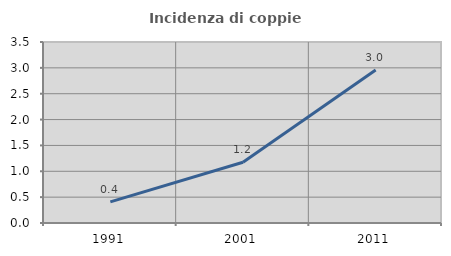
| Category | Incidenza di coppie miste |
|---|---|
| 1991.0 | 0.408 |
| 2001.0 | 1.174 |
| 2011.0 | 2.958 |